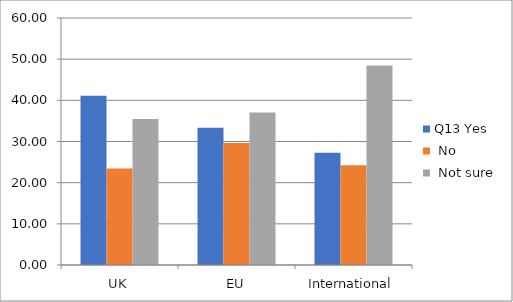
| Category | Q13 Yes | Q13 No | Q13 Not sure |
|---|---|---|---|
| UK | 41.139 | 23.418 | 35.443 |
| EU | 33.333 | 29.63 | 37.037 |
| International | 27.273 | 24.242 | 48.485 |